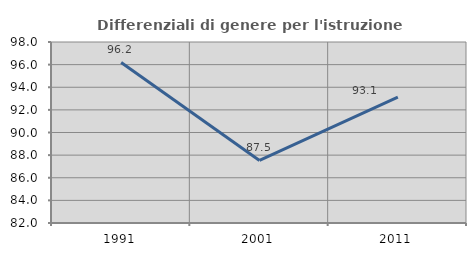
| Category | Differenziali di genere per l'istruzione superiore |
|---|---|
| 1991.0 | 96.191 |
| 2001.0 | 87.53 |
| 2011.0 | 93.131 |